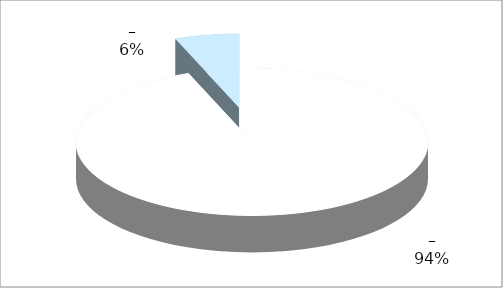
| Category | Series 0 |
|---|---|
| 0 | 16 |
| 1 | 1 |